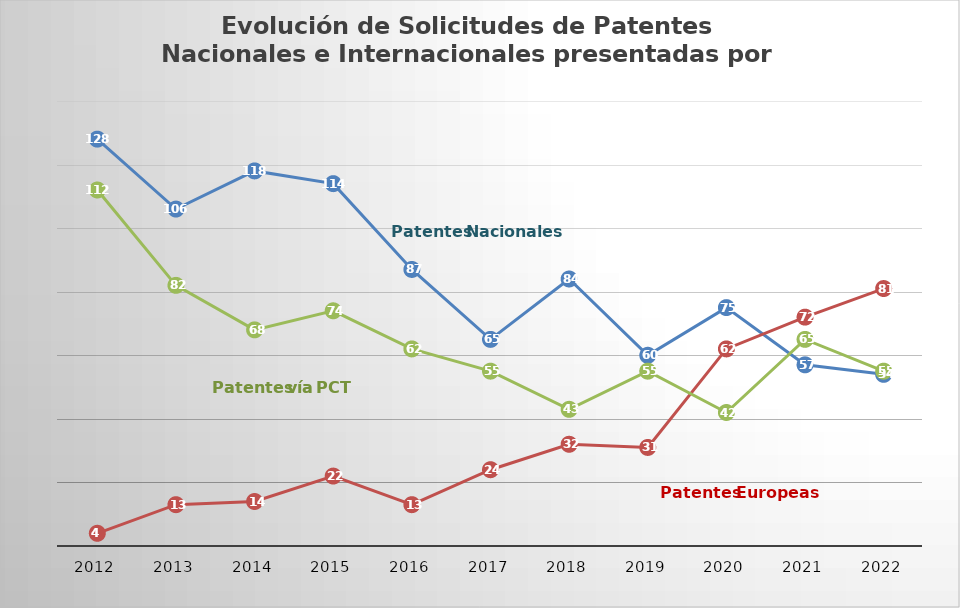
| Category | Patentes Nacionales  | Patentes Europeas  | Patentes Internacionales (PCT)  |
|---|---|---|---|
| 2012.0 | 128 | 4 | 112 |
| 2013.0 | 106 | 13 | 82 |
| 2014.0 | 118 | 14 | 68 |
| 2015.0 | 114 | 22 | 74 |
| 2016.0 | 87 | 13 | 62 |
| 2017.0 | 65 | 24 | 55 |
| 2018.0 | 84 | 32 | 43 |
| 2019.0 | 60 | 31 | 55 |
| 2020.0 | 75 | 62 | 42 |
| 2021.0 | 57 | 72 | 65 |
| 2022.0 | 54 | 81 | 55 |